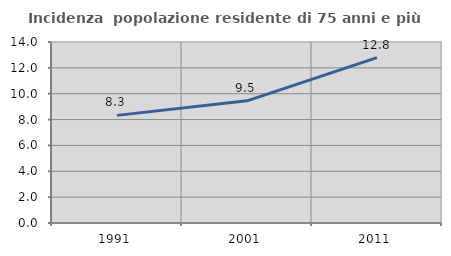
| Category | Incidenza  popolazione residente di 75 anni e più |
|---|---|
| 1991.0 | 8.324 |
| 2001.0 | 9.451 |
| 2011.0 | 12.788 |